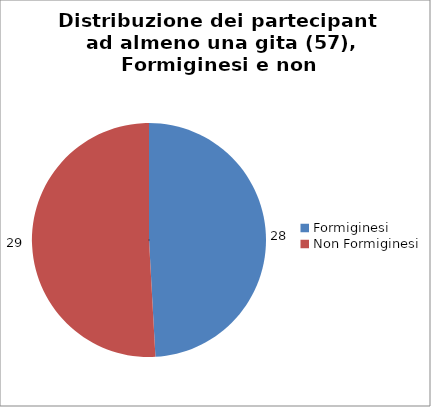
| Category | Nr. Tesserati |
|---|---|
| Formiginesi | 28 |
| Non Formiginesi | 29 |